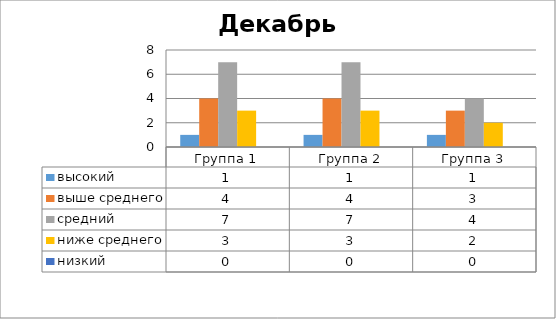
| Category | высокий | выше среднего | средний | ниже среднего | низкий |
|---|---|---|---|---|---|
| Группа 1 | 1 | 4 | 7 | 3 | 0 |
| Группа 2 | 1 | 4 | 7 | 3 | 0 |
| Группа 3 | 1 | 3 | 4 | 2 | 0 |